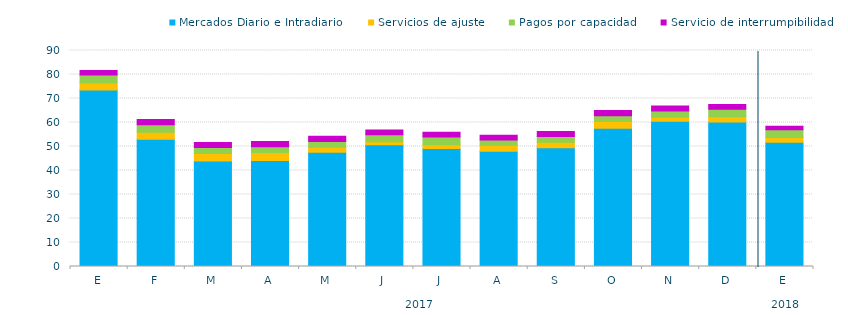
| Category | Mercados Diario e Intradiario  | Servicios de ajuste | Pagos por capacidad | Servicio de interrumpibilidad |
|---|---|---|---|---|
| E | 73.59 | 2.89 | 3.26 | 1.88 |
| F | 53.05 | 2.84 | 3.17 | 2.17 |
| M | 43.94 | 3.13 | 2.52 | 2.06 |
| A | 44.2 | 3.27 | 2.38 | 2.28 |
| M | 47.6 | 2.13 | 2.37 | 2.15 |
| J | 50.77 | 1.24 | 2.9 | 2 |
| J | 49.13 | 1.65 | 3.22 | 1.93 |
| A | 48.03 | 2.49 | 2.16 | 1.99 |
| S | 49.52 | 2.2 | 2.41 | 2.14 |
| O | 57.6 | 2.79 | 2.41 | 2.16 |
| N | 60.54 | 1.66 | 2.58 | 2.08 |
| D | 60.16 | 2.24 | 3.15 | 1.96 |
| E | 51.77 | 1.95 | 3.3 | 1.38 |